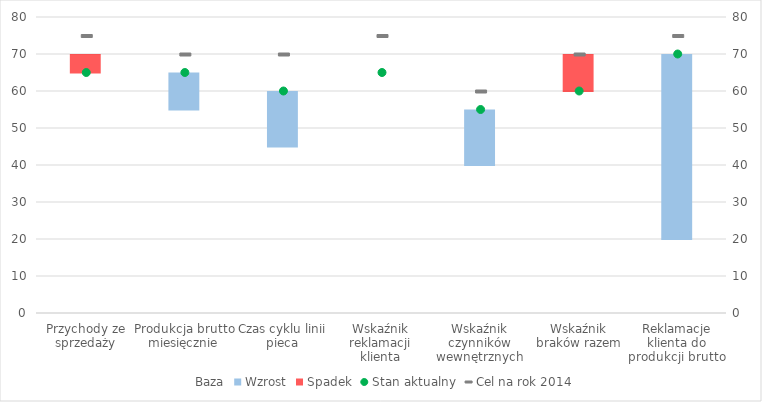
| Category | Baza | Wzrost | Spadek |
|---|---|---|---|
| Przychody ze sprzedaży | 65 | 0 | 5 |
| Produkcja brutto miesięcznie | 55 | 10 | 0 |
| Czas cyklu linii pieca | 45 | 15 | 0 |
| Wskaźnik reklamacji klienta | 65 | 0 | 0 |
| Wskaźnik czynników wewnętrznych | 40 | 15 | 0 |
| Wskaźnik braków razem | 60 | 0 | 10 |
| Reklamacje klienta do produkcji brutto | 20 | 50 | 0 |